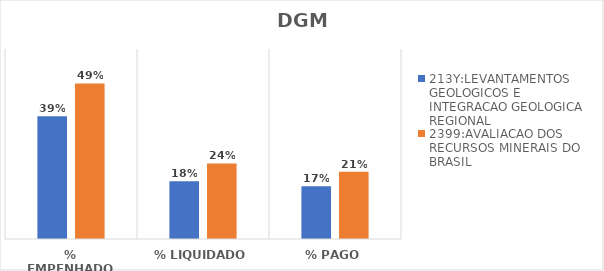
| Category | 213Y:LEVANTAMENTOS GEOLOGICOS E INTEGRACAO GEOLOGICA REGIONAL | 2399:AVALIACAO DOS RECURSOS MINERAIS DO BRASIL |
|---|---|---|
| % EMPENHADO | 0.388 | 0.491 |
| % LIQUIDADO | 0.182 | 0.239 |
| % PAGO | 0.166 | 0.212 |